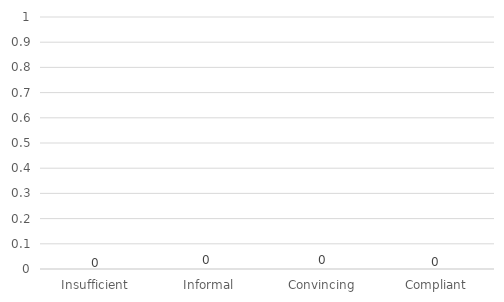
| Category | Series 0 |
|---|---|
| Insufficient | 0 |
| Informal | 0 |
| Convincing | 0 |
| Compliant | 0 |